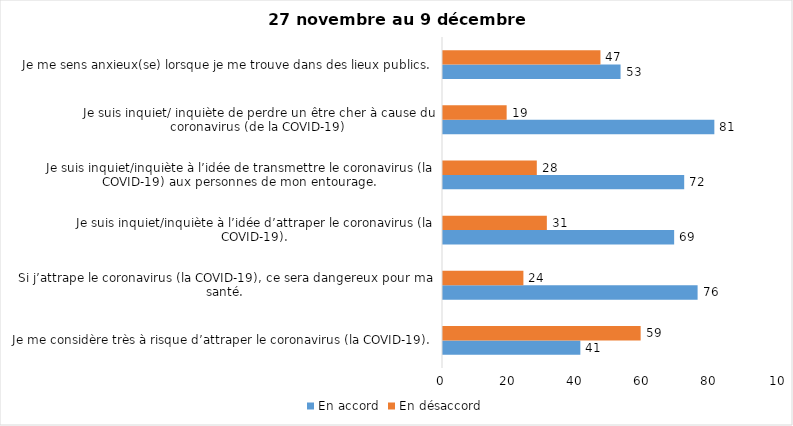
| Category | En accord | En désaccord |
|---|---|---|
| Je me considère très à risque d’attraper le coronavirus (la COVID-19). | 41 | 59 |
| Si j’attrape le coronavirus (la COVID-19), ce sera dangereux pour ma santé. | 76 | 24 |
| Je suis inquiet/inquiète à l’idée d’attraper le coronavirus (la COVID-19). | 69 | 31 |
| Je suis inquiet/inquiète à l’idée de transmettre le coronavirus (la COVID-19) aux personnes de mon entourage. | 72 | 28 |
| Je suis inquiet/ inquiète de perdre un être cher à cause du coronavirus (de la COVID-19) | 81 | 19 |
| Je me sens anxieux(se) lorsque je me trouve dans des lieux publics. | 53 | 47 |